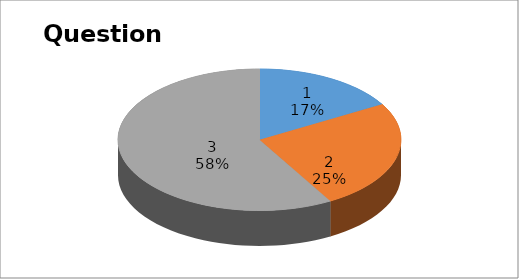
| Category | Series 0 |
|---|---|
| 0 | 6 |
| 1 | 9 |
| 2 | 21 |